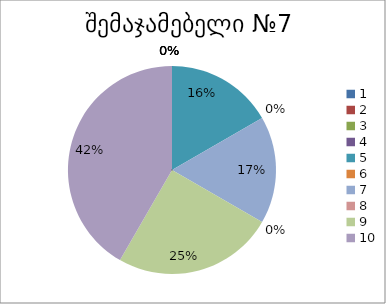
| Category | რაოდენობა | ქულა |
|---|---|---|
| 0 | 0 | 1 |
| 1 | 0 | 2 |
| 2 | 0 | 3 |
| 3 | 0 | 4 |
| 4 | 2 | 5 |
| 5 | 0 | 6 |
| 6 | 2 | 7 |
| 7 | 0 | 8 |
| 8 | 3 | 9 |
| 9 | 5 | 10 |